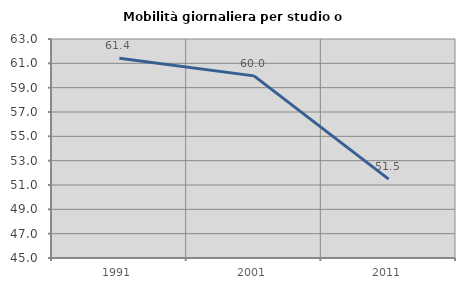
| Category | Mobilità giornaliera per studio o lavoro |
|---|---|
| 1991.0 | 61.412 |
| 2001.0 | 59.969 |
| 2011.0 | 51.481 |